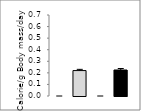
| Category | Series 0 |
|---|---|
| fh2O | 0 |
| fapi | 0.22 |